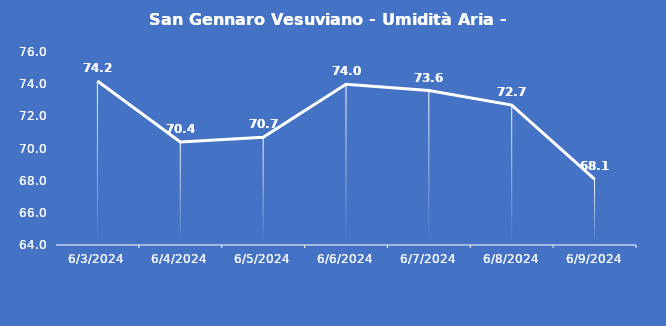
| Category | San Gennaro Vesuviano - Umidità Aria - Grezzo (%) |
|---|---|
| 6/3/24 | 74.2 |
| 6/4/24 | 70.4 |
| 6/5/24 | 70.7 |
| 6/6/24 | 74 |
| 6/7/24 | 73.6 |
| 6/8/24 | 72.7 |
| 6/9/24 | 68.1 |